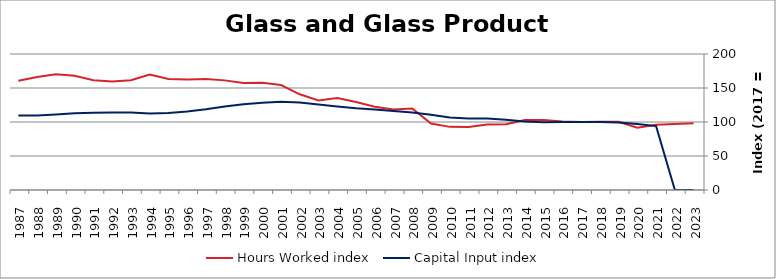
| Category | Hours Worked index | Capital Input index |
|---|---|---|
| 2023.0 | 98.125 | 0 |
| 2022.0 | 97.087 | 0 |
| 2021.0 | 95.804 | 93.936 |
| 2020.0 | 91.73 | 96.977 |
| 2019.0 | 100.229 | 99.144 |
| 2018.0 | 100.295 | 99.972 |
| 2017.0 | 100 | 100 |
| 2016.0 | 100.631 | 99.881 |
| 2015.0 | 102.834 | 99.785 |
| 2014.0 | 103.03 | 100.915 |
| 2013.0 | 96.834 | 103.217 |
| 2012.0 | 96.351 | 104.974 |
| 2011.0 | 92.537 | 105.252 |
| 2010.0 | 92.843 | 106.764 |
| 2009.0 | 97.744 | 110.799 |
| 2008.0 | 119.785 | 113.819 |
| 2007.0 | 118.364 | 116.234 |
| 2006.0 | 122.302 | 118.33 |
| 2005.0 | 129.299 | 120.146 |
| 2004.0 | 135.111 | 122.927 |
| 2003.0 | 131.761 | 125.903 |
| 2002.0 | 140.719 | 128.649 |
| 2001.0 | 154.279 | 129.804 |
| 2000.0 | 157.726 | 128.477 |
| 1999.0 | 157.298 | 126.119 |
| 1998.0 | 161.216 | 122.664 |
| 1997.0 | 163.207 | 118.804 |
| 1996.0 | 162.337 | 115.614 |
| 1995.0 | 163.274 | 113.109 |
| 1994.0 | 169.863 | 112.671 |
| 1993.0 | 161.312 | 113.796 |
| 1992.0 | 159.41 | 114.147 |
| 1991.0 | 161.539 | 113.545 |
| 1990.0 | 167.92 | 112.794 |
| 1989.0 | 170.227 | 111.075 |
| 1988.0 | 166.11 | 109.674 |
| 1987.0 | 160.537 | 109.496 |